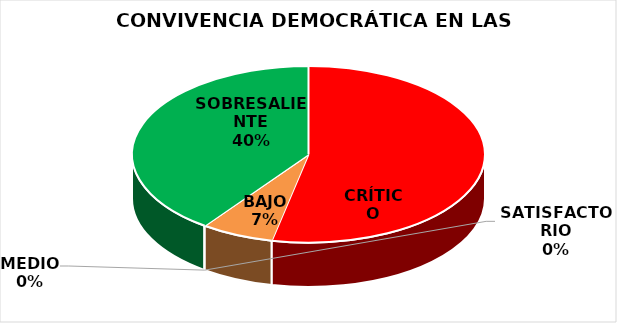
| Category | Series 0 |
|---|---|
| CRÍTICO | 8 |
| BAJO | 1 |
| MEDIO | 0 |
| SATISFACTORIO | 0 |
| SOBRESALIENTE | 6 |